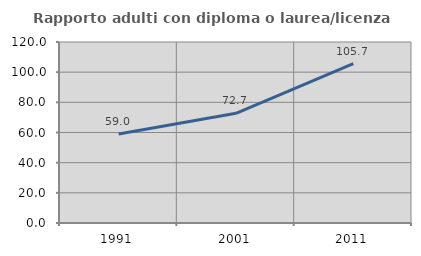
| Category | Rapporto adulti con diploma o laurea/licenza media  |
|---|---|
| 1991.0 | 58.961 |
| 2001.0 | 72.718 |
| 2011.0 | 105.693 |